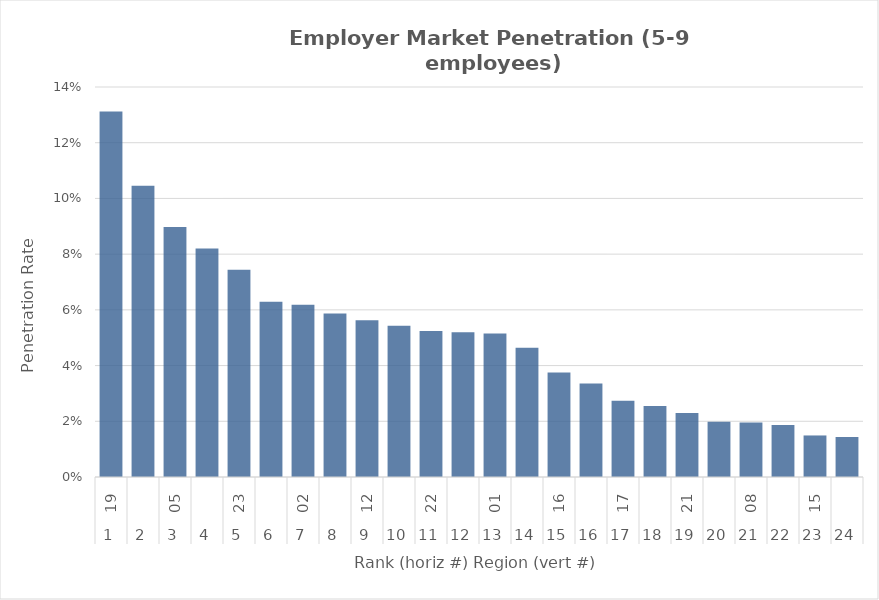
| Category | Rate |
|---|---|
| 0 | 0.131 |
| 1 | 0.105 |
| 2 | 0.09 |
| 3 | 0.082 |
| 4 | 0.074 |
| 5 | 0.063 |
| 6 | 0.062 |
| 7 | 0.059 |
| 8 | 0.056 |
| 9 | 0.054 |
| 10 | 0.052 |
| 11 | 0.052 |
| 12 | 0.052 |
| 13 | 0.046 |
| 14 | 0.038 |
| 15 | 0.034 |
| 16 | 0.027 |
| 17 | 0.025 |
| 18 | 0.023 |
| 19 | 0.02 |
| 20 | 0.02 |
| 21 | 0.019 |
| 22 | 0.015 |
| 23 | 0.014 |